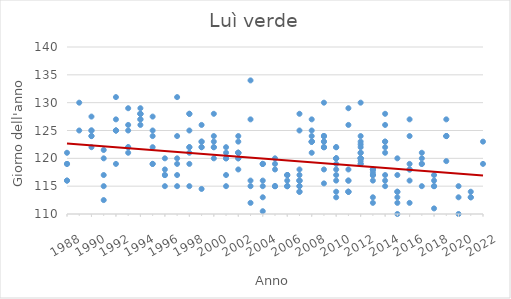
| Category | Series 0 |
|---|---|
| 1988.0 | 116 |
| 1988.0 | 119 |
| 1988.0 | 121 |
| 1988.0 | 119 |
| 1988.0 | 116 |
| 1989.0 | 125 |
| 1989.0 | 130 |
| 1990.0 | 124 |
| 1990.0 | 125 |
| 1990.0 | 122 |
| 1990.0 | 127.5 |
| 1990.0 | 124 |
| 1990.0 | 125 |
| 1991.0 | 108.5 |
| 1991.0 | 120 |
| 1991.0 | 117 |
| 1991.0 | 112.5 |
| 1991.0 | 115 |
| 1991.0 | 121.5 |
| 1992.0 | 127 |
| 1992.0 | 125 |
| 1992.0 | 125 |
| 1992.0 | 131 |
| 1992.0 | 119 |
| 1992.0 | 125 |
| 1993.0 | 122 |
| 1993.0 | 129 |
| 1993.0 | 122 |
| 1993.0 | 126 |
| 1993.0 | 125 |
| 1993.0 | 121 |
| 1994.0 | 128 |
| 1994.0 | 127 |
| 1994.0 | 128 |
| 1994.0 | 128 |
| 1994.0 | 129 |
| 1994.0 | 127 |
| 1994.0 | 126 |
| 1995.0 | 119 |
| 1995.0 | 125 |
| 1995.0 | 124 |
| 1995.0 | 122 |
| 1995.0 | 127.5 |
| 1995.0 | 119 |
| 1996.0 | 117 |
| 1996.0 | 118 |
| 1996.0 | 117 |
| 1996.0 | 115 |
| 1996.0 | 120 |
| 1997.0 | 119 |
| 1997.0 | 117 |
| 1997.0 | 124 |
| 1997.0 | 105 |
| 1997.0 | 131 |
| 1997.0 | 115 |
| 1997.0 | 120 |
| 1998.0 | 119 |
| 1998.0 | 122 |
| 1998.0 | 128 |
| 1998.0 | 121 |
| 1998.0 | 125 |
| 1998.0 | 122 |
| 1998.0 | 115 |
| 1998.0 | 128 |
| 1999.0 | 126 |
| 1999.0 | 123 |
| 1999.0 | 122 |
| 1999.0 | 114.5 |
| 1999.0 | 122 |
| 1999.0 | 123 |
| 2000.0 | 124 |
| 2000.0 | 128 |
| 2000.0 | 122 |
| 2000.0 | 123 |
| 2000.0 | 120 |
| 2000.0 | 122 |
| 2001.0 | 120 |
| 2001.0 | 115 |
| 2001.0 | 121 |
| 2001.0 | 117 |
| 2001.0 | 120 |
| 2001.0 | 122 |
| 2002.0 | 120 |
| 2002.0 | 121 |
| 2002.0 | 121 |
| 2002.0 | 124 |
| 2002.0 | 118 |
| 2002.0 | 120 |
| 2002.0 | 121 |
| 2002.0 | 123 |
| 2002.0 | 121 |
| 2003.0 | 112 |
| 2003.0 | 134 |
| 2003.0 | 109 |
| 2003.0 | 116 |
| 2003.0 | 115 |
| 2003.0 | 127 |
| 2004.0 | 119 |
| 2004.0 | 115 |
| 2004.0 | 113 |
| 2004.0 | 119 |
| 2004.0 | 116 |
| 2004.0 | 110.5 |
| 2004.0 | 119 |
| 2005.0 | 118 |
| 2005.0 | 105 |
| 2005.0 | 115 |
| 2005.0 | 115 |
| 2005.0 | 115 |
| 2005.0 | 120 |
| 2005.0 | 119 |
| 2006.0 | 115 |
| 2006.0 | 117 |
| 2006.0 | 115 |
| 2006.0 | 117 |
| 2006.0 | 115 |
| 2006.0 | 116 |
| 2006.0 | 117 |
| 2007.0 | 115 |
| 2007.0 | 114 |
| 2007.0 | 125 |
| 2007.0 | 116 |
| 2007.0 | 115 |
| 2007.0 | 116 |
| 2007.0 | 114 |
| 2007.0 | 116 |
| 2007.0 | 118 |
| 2007.0 | 117 |
| 2007.0 | 128 |
| 2008.0 | 109 |
| 2008.0 | 123 |
| 2008.0 | 121 |
| 2008.0 | 123 |
| 2008.0 | 124 |
| 2008.0 | 127 |
| 2008.0 | 123 |
| 2008.0 | 123 |
| 2008.0 | 125 |
| 2009.0 | 123 |
| 2009.0 | 115.5 |
| 2009.0 | 124 |
| 2009.0 | 123 |
| 2009.0 | 122 |
| 2009.0 | 130 |
| 2009.0 | 118 |
| 2009.0 | 122 |
| 2009.0 | 124 |
| 2009.0 | 124 |
| 2009.0 | 122 |
| 2010.0 | 120 |
| 2010.0 | 118 |
| 2010.0 | 122 |
| 2010.0 | 120 |
| 2010.0 | 119 |
| 2010.0 | 113 |
| 2010.0 | 114 |
| 2010.0 | 117 |
| 2010.0 | 122 |
| 2010.0 | 116 |
| 2010.0 | 120 |
| 2011.0 | 129 |
| 2011.0 | 118 |
| 2011.0 | 114 |
| 2011.0 | 114 |
| 2011.0 | 116 |
| 2011.0 | 126 |
| 2011.0 | 116 |
| 2011.0 | 114 |
| 2012.0 | 124 |
| 2012.0 | 123 |
| 2012.0 | 120 |
| 2012.0 | 120 |
| 2012.0 | 121 |
| 2012.0 | 120 |
| 2012.0 | 122.5 |
| 2012.0 | 119.5 |
| 2012.0 | 130 |
| 2012.0 | 120 |
| 2012.0 | 121 |
| 2012.0 | 119 |
| 2012.0 | 119 |
| 2012.0 | 122 |
| 2013.0 | 112 |
| 2013.0 | 113 |
| 2013.0 | 118 |
| 2013.0 | 118 |
| 2013.0 | 116 |
| 2013.0 | 117 |
| 2013.0 | 118 |
| 2013.0 | 117 |
| 2013.0 | 106 |
| 2013.0 | 117 |
| 2013.0 | 117.5 |
| 2014.0 | 121 |
| 2014.0 | 123 |
| 2014.0 | 115 |
| 2014.0 | 122 |
| 2014.0 | 117 |
| 2014.0 | 128 |
| 2014.0 | 126 |
| 2014.0 | 116 |
| 2014.0 | 123 |
| 2015.0 | 114 |
| 2015.0 | 112 |
| 2015.0 | 110 |
| 2015.0 | 120 |
| 2015.0 | 113 |
| 2015.0 | 117 |
| 2015.0 | 114 |
| 2016.0 | 119 |
| 2016.0 | 118 |
| 2016.0 | 127 |
| 2016.0 | 124 |
| 2016.0 | 116 |
| 2016.0 | 112 |
| 2016.0 | 118 |
| 2017.0 | 121 |
| 2017.0 | 120 |
| 2017.0 | 119 |
| 2017.0 | 119 |
| 2017.0 | 115 |
| 2018.0 | 111 |
| 2018.0 | 115 |
| 2018.0 | 116 |
| 2018.0 | 117 |
| 2018.0 | 115 |
| 2019.0 | 127 |
| 2019.0 | 124 |
| 2019.0 | 124 |
| 2019.0 | 124 |
| 2019.0 | 119.5 |
| 2020.0 | 110 |
| 2020.0 | 113 |
| 2020.0 | 115 |
| 2021.0 | 113 |
| 2021.0 | 114 |
| 2021.0 | 113 |
| 2022.0 | 119 |
| 2022.0 | 123 |